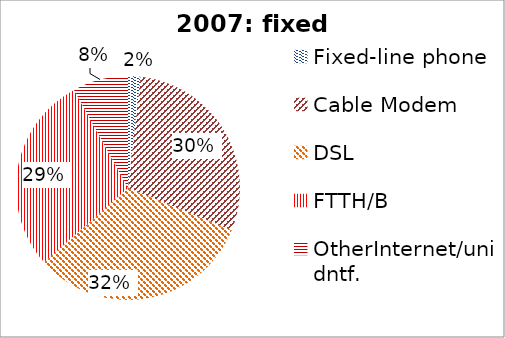
| Category | Series 0 |
|---|---|
| Fixed-line phone | 30315484993 |
| Cable Modem | 490449818869 |
| DSL | 540327775951 |
| FTTH/B | 476836908491 |
| OtherInternet/unidntf. | 133853524996 |